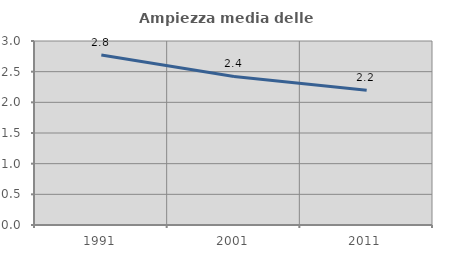
| Category | Ampiezza media delle famiglie |
|---|---|
| 1991.0 | 2.773 |
| 2001.0 | 2.422 |
| 2011.0 | 2.199 |